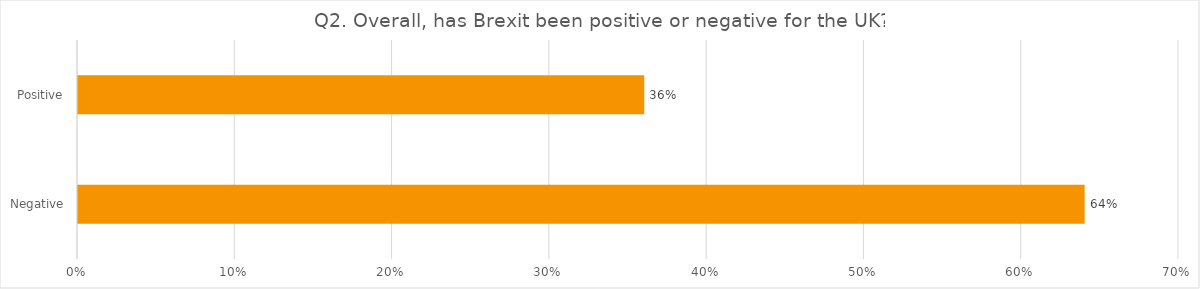
| Category | Q2. Overall, has Brexit been positive or negative for the UK? |
|---|---|
| Negative | 0.64 |
| Positive | 0.36 |